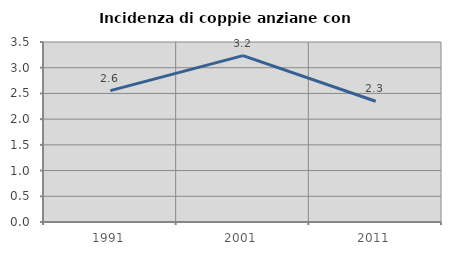
| Category | Incidenza di coppie anziane con figli |
|---|---|
| 1991.0 | 2.555 |
| 2001.0 | 3.236 |
| 2011.0 | 2.348 |